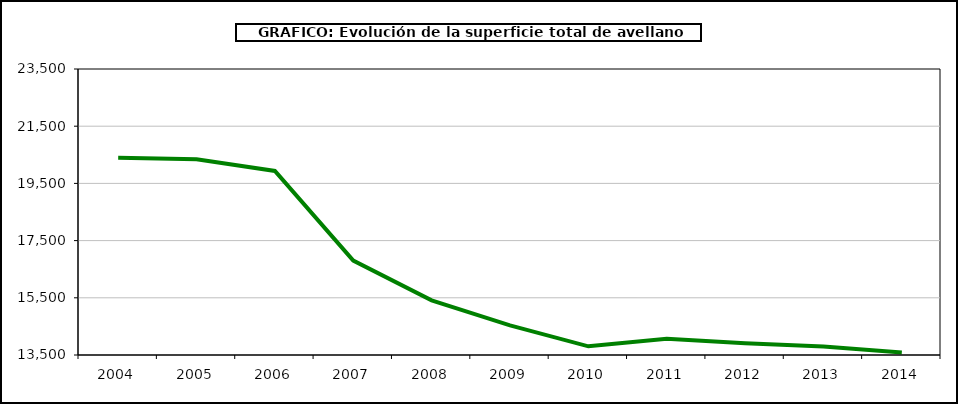
| Category | superficie avellano |
|---|---|
| 2004.0 | 20395 |
| 2005.0 | 20343 |
| 2006.0 | 19937 |
| 2007.0 | 16802 |
| 2008.0 | 15411 |
| 2009.0 | 14536 |
| 2010.0 | 13803 |
| 2011.0 | 14067 |
| 2012.0 | 13912 |
| 2013.0 | 13796 |
| 2014.0 | 13591 |